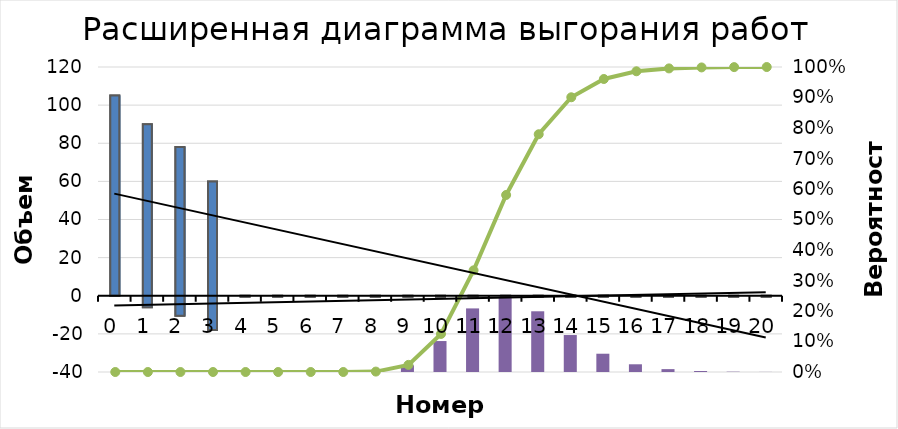
| Category | Prob |
|---|---|
| 0.0 | 0 |
| 1.0 | 0 |
| 2.0 | 0 |
| 3.0 | 0 |
| 4.0 | 0 |
| 5.0 | 0 |
| 6.0 | 0 |
| 7.0 | 0 |
| 8.0 | 0.001 |
| 9.0 | 0.022 |
| 10.0 | 0.101 |
| 11.0 | 0.209 |
| 12.0 | 0.247 |
| 13.0 | 0.199 |
| 14.0 | 0.121 |
| 15.0 | 0.06 |
| 16.0 | 0.025 |
| 17.0 | 0.009 |
| 18.0 | 0.003 |
| 19.0 | 0.001 |
| 20.0 | 0 |